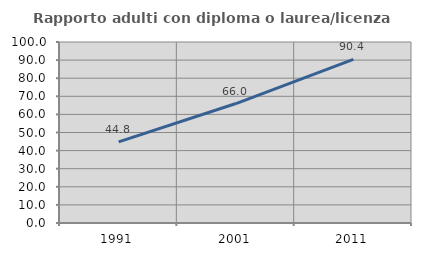
| Category | Rapporto adulti con diploma o laurea/licenza media  |
|---|---|
| 1991.0 | 44.824 |
| 2001.0 | 65.998 |
| 2011.0 | 90.37 |